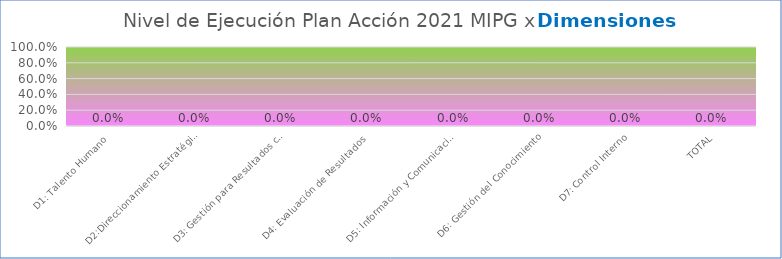
| Category | Series 0 |
|---|---|
| D1: Talento Humano | 0 |
| D2:Direccionamiento Estratégico y Planeación | 0 |
| D3: Gestión para Resultados con Valores | 0 |
| D4: Evaluación de Resultados | 0 |
| D5: Información y Comunicación | 0 |
| D6: Gestión del Conocimiento | 0 |
| D7: Control Interno | 0 |
| TOTAL | 0 |